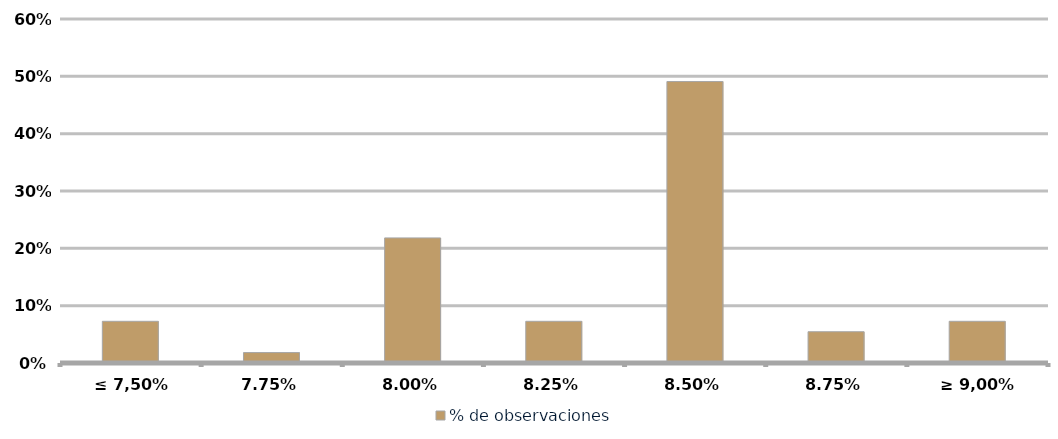
| Category | % de observaciones  |
|---|---|
| ≤ 7,50% | 0.073 |
| 7,75% | 0.018 |
| 8,00% | 0.218 |
| 8,25% | 0.073 |
| 8,50% | 0.491 |
| 8,75% | 0.055 |
| ≥ 9,00% | 0.073 |